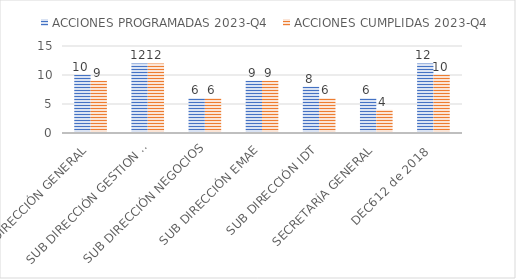
| Category | ACCIONES PROGRAMADAS 2023-Q4 | ACCIONES CUMPLIDAS 2023-Q4 |
|---|---|---|
| DIRECCIÓN GENERAL | 10 | 9 |
| SUB DIRECCIÓN GESTION CONTRACTUAL | 12 | 12 |
| SUB DIRECCIÓN NEGOCIOS | 6 | 6 |
| SUB DIRECCIÓN EMAE | 9 | 9 |
| SUB DIRECCIÓN IDT | 8 | 6 |
| SECRETARÍA GENERAL | 6 | 4 |
| DEC612 de 2018  | 12 | 10 |